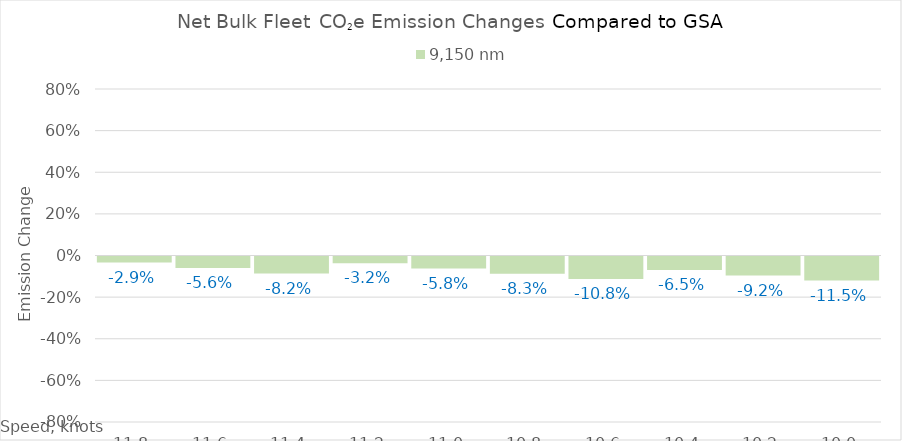
| Category | 9,150 |
|---|---|
| 11.8 | -0.029 |
| 11.600000000000001 | -0.056 |
| 11.400000000000002 | -0.082 |
| 11.200000000000003 | -0.032 |
| 11.000000000000004 | -0.058 |
| 10.800000000000004 | -0.083 |
| 10.600000000000005 | -0.108 |
| 10.400000000000006 | -0.065 |
| 10.200000000000006 | -0.092 |
| 10.000000000000007 | -0.115 |